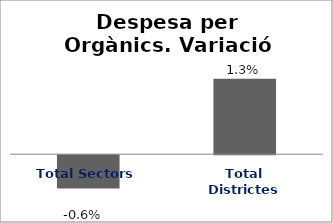
| Category | Series 0 |
|---|---|
| Total Sectors | -0.006 |
| Total Districtes | 0.013 |